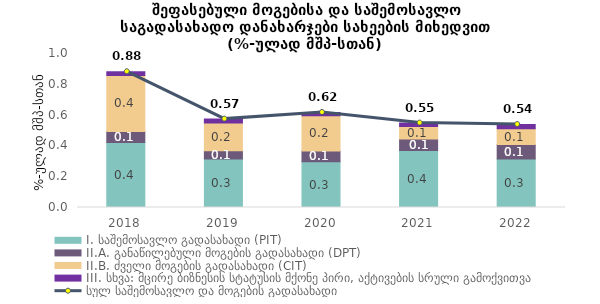
| Category | I. საშემოსავლო გადასახადი (PIT)  | II.A. განაწილებული მოგების გადასახადი (DPT) | II.B. ძველი მოგების გადასახადი (CIT)  | III. სხვა: მცირე ბიზნესის სტატუსის მქონე პირი, აქტივების სრული გამოქვითვა  |
|---|---|---|---|---|
| 2018.0 | 0.423 | 0.071 | 0.364 | 0.024 |
| 2019.0 | 0.314 | 0.054 | 0.181 | 0.024 |
| 2020.0 | 0.296 | 0.071 | 0.228 | 0.021 |
| 2021.0 | 0.37 | 0.076 | 0.08 | 0.023 |
| 2022.0 | 0.315 | 0.094 | 0.102 | 0.028 |